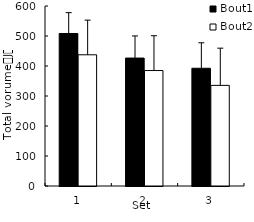
| Category | Bout1 | Bout2 |
|---|---|---|
| 1.0 | 508.35 | 437.388 |
| 2.0 | 426.412 | 384.875 |
| 3.0 | 392.463 | 335.45 |